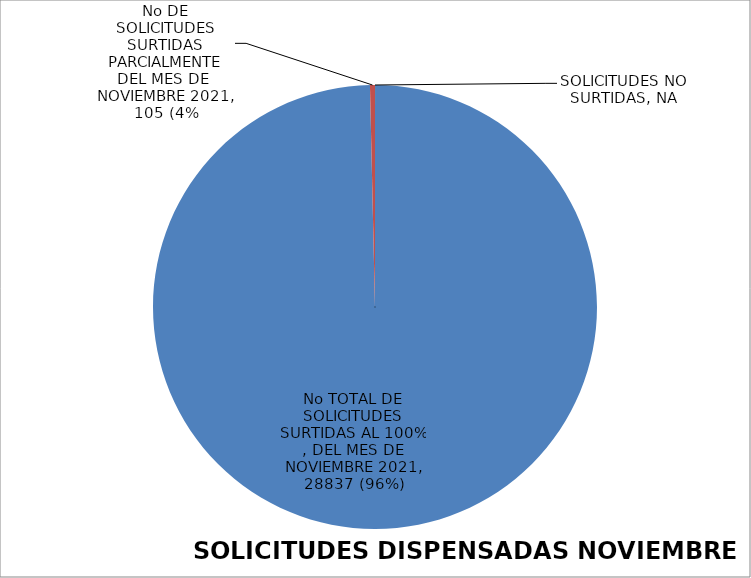
| Category | Series 0 |
|---|---|
| No TOTAL DE SOLICITUDES SURTIDAS AL 100% , DEL MES DE NOVIEMBRE 2021 | 28837 |
| No DE SOLICITUDES SURTIDAS PARCIALMENTE DEL MES DE  NOVIEMBRE 2021 | 105 |
| SOLICITUDES NO SURTIDAS | 0 |